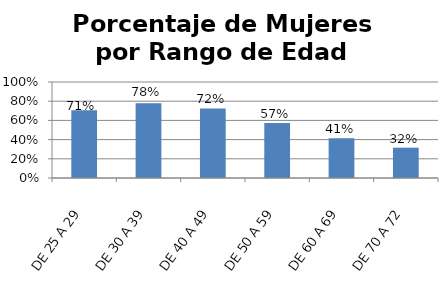
| Category | Porcentaje |
|---|---|
| DE 25 A 29 | 0.707 |
| DE 30 A 39 | 0.78 |
| DE 40 A 49 | 0.725 |
| DE 50 A 59 | 0.574 |
| DE 60 A 69 | 0.414 |
| DE 70 A 72 | 0.316 |